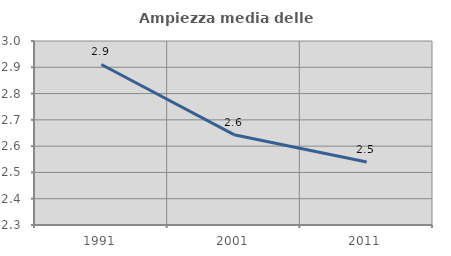
| Category | Ampiezza media delle famiglie |
|---|---|
| 1991.0 | 2.911 |
| 2001.0 | 2.644 |
| 2011.0 | 2.54 |